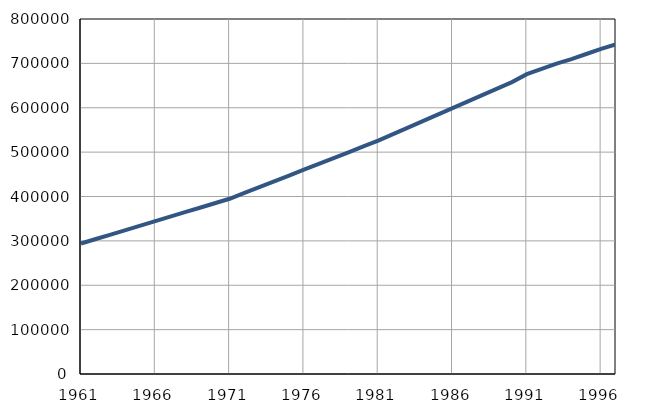
| Category | Број
становника |
|---|---|
| 1961.0 | 294054 |
| 1962.0 | 304136 |
| 1963.0 | 314218 |
| 1964.0 | 324300 |
| 1965.0 | 334382 |
| 1966.0 | 344464 |
| 1967.0 | 354546 |
| 1968.0 | 364628 |
| 1969.0 | 374710 |
| 1970.0 | 384792 |
| 1971.0 | 394873 |
| 1972.0 | 407967 |
| 1973.0 | 421061 |
| 1974.0 | 434155 |
| 1975.0 | 447249 |
| 1976.0 | 460343 |
| 1977.0 | 473437 |
| 1978.0 | 486531 |
| 1979.0 | 499625 |
| 1980.0 | 512719 |
| 1981.0 | 525796 |
| 1982.0 | 540461 |
| 1983.0 | 555126 |
| 1984.0 | 569791 |
| 1985.0 | 584456 |
| 1986.0 | 599121 |
| 1987.0 | 613786 |
| 1988.0 | 628451 |
| 1989.0 | 643116 |
| 1990.0 | 657781 |
| 1991.0 | 675700 |
| 1992.0 | 687400 |
| 1993.0 | 699500 |
| 1994.0 | 709600 |
| 1995.0 | 721100 |
| 1996.0 | 732800 |
| 1997.0 | 743100 |